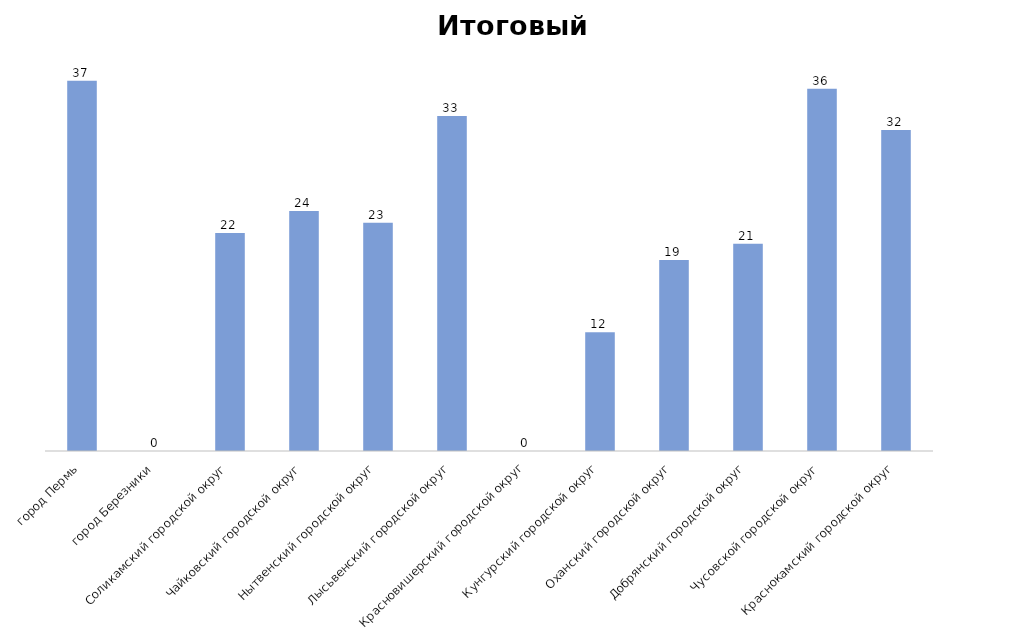
| Category | Series 0 |
|---|---|
| город Пермь | 36.937 |
| город Березники | 0 |
| Соликамский городской округ | 21.749 |
| Чайковский городской округ | 23.931 |
| Нытвенский городской округ | 22.769 |
| Лысьвенский городской округ | 33.407 |
| Красновишерский городской округ | 0 |
| Кунгурский городской округ | 11.852 |
| Оханский городской округ | 19.058 |
| Добрянский городской округ | 20.678 |
| Чусовской городской округ | 36.146 |
| Краснокамский городской округ | 32.015 |